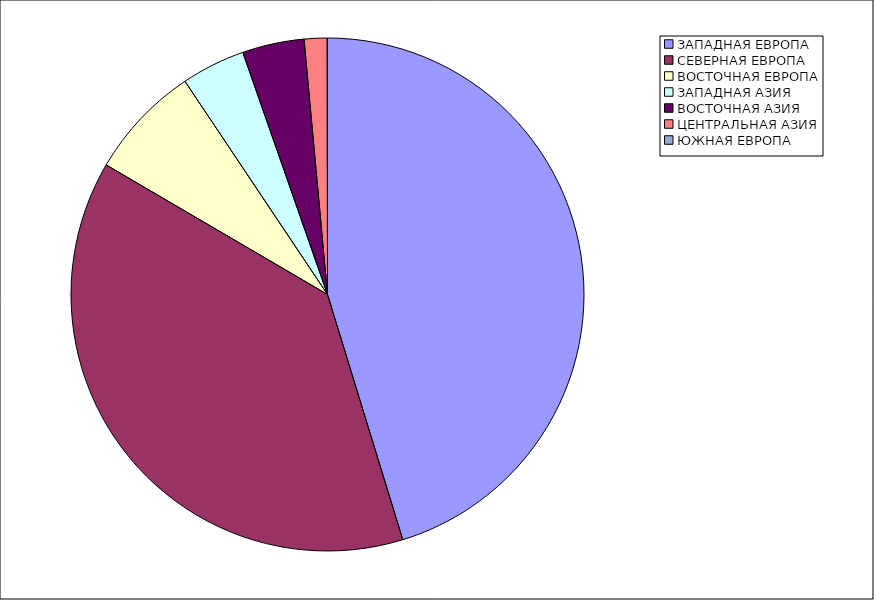
| Category | Оборот |
|---|---|
| ЗАПАДНАЯ ЕВРОПА | 45.259 |
| СЕВЕРНАЯ ЕВРОПА | 38.171 |
| ВОСТОЧНАЯ ЕВРОПА | 7.191 |
| ЗАПАДНАЯ АЗИЯ | 4.025 |
| ВОСТОЧНАЯ АЗИЯ | 3.896 |
| ЦЕНТРАЛЬНАЯ АЗИЯ | 1.441 |
| ЮЖНАЯ ЕВРОПА | 0.018 |